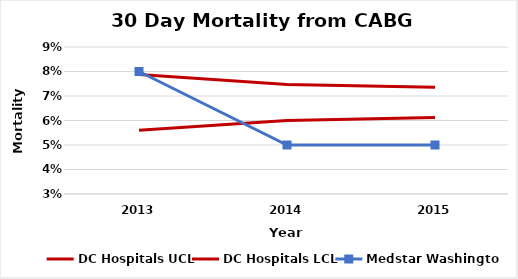
| Category | DC Hospitals UCL | DC Hospitals LCL | Medstar Washington |
|---|---|---|---|
| 2013.0 | 0.079 | 0.056 | 0.08 |
| 2014.0 | 0.075 | 0.06 | 0.05 |
| 2015.0 | 0.074 | 0.061 | 0.05 |